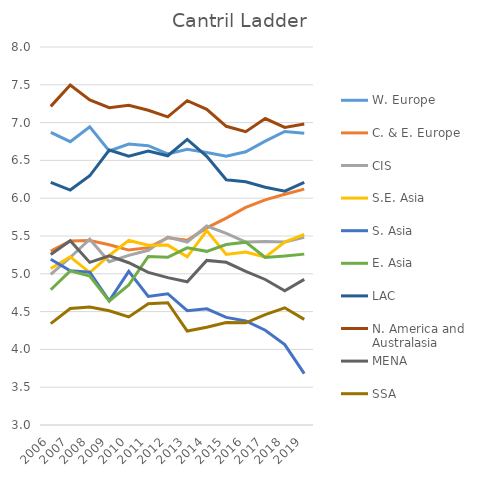
| Category | W. Europe | C. & E. Europe | CIS | S.E. Asia | S. Asia | E. Asia | LAC | N. America and Australasia | MENA | SSA |
|---|---|---|---|---|---|---|---|---|---|---|
| 2006.0 | 6.87 | 5.3 | 4.991 | 5.07 | 5.192 | 4.789 | 6.21 | 7.215 | 5.255 | 4.341 |
| 2007.0 | 6.747 | 5.435 | 5.216 | 5.226 | 5.039 | 5.039 | 6.108 | 7.497 | 5.438 | 4.541 |
| 2008.0 | 6.945 | 5.439 | 5.457 | 5.016 | 5.02 | 4.97 | 6.296 | 7.299 | 5.151 | 4.56 |
| 2009.0 | 6.626 | 5.383 | 5.161 | 5.242 | 4.642 | 4.639 | 6.637 | 7.198 | 5.236 | 4.511 |
| 2010.0 | 6.715 | 5.314 | 5.243 | 5.441 | 5.031 | 4.852 | 6.555 | 7.228 | 5.147 | 4.429 |
| 2011.0 | 6.694 | 5.346 | 5.311 | 5.377 | 4.701 | 5.229 | 6.625 | 7.163 | 5.019 | 4.603 |
| 2012.0 | 6.585 | 5.476 | 5.486 | 5.38 | 4.736 | 5.218 | 6.561 | 7.077 | 4.949 | 4.617 |
| 2013.0 | 6.648 | 5.444 | 5.421 | 5.225 | 4.513 | 5.344 | 6.777 | 7.29 | 4.894 | 4.243 |
| 2014.0 | 6.603 | 5.608 | 5.631 | 5.571 | 4.536 | 5.297 | 6.554 | 7.176 | 5.177 | 4.293 |
| 2015.0 | 6.555 | 5.737 | 5.536 | 5.256 | 4.423 | 5.387 | 6.243 | 6.951 | 5.152 | 4.356 |
| 2016.0 | 6.614 | 5.878 | 5.42 | 5.287 | 4.375 | 5.419 | 6.216 | 6.879 | 5.031 | 4.352 |
| 2017.0 | 6.755 | 5.978 | 5.426 | 5.221 | 4.253 | 5.216 | 6.145 | 7.053 | 4.925 | 4.46 |
| 2018.0 | 6.882 | 6.053 | 5.421 | 5.421 | 4.063 | 5.234 | 6.093 | 6.936 | 4.776 | 4.55 |
| 2019.0 | 6.858 | 6.121 | 5.483 | 5.52 | 3.681 | 5.26 | 6.208 | 6.981 | 4.926 | 4.397 |